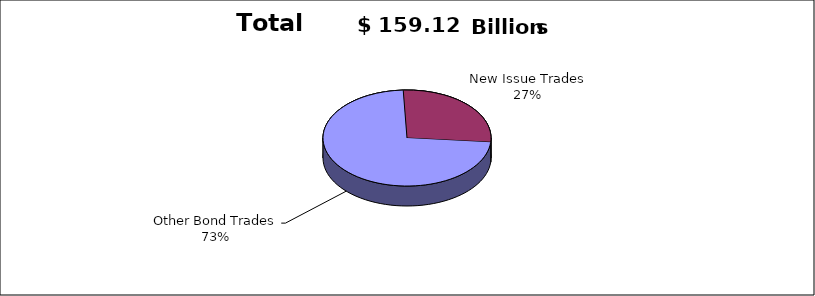
| Category | Series 0 |
|---|---|
| Other Bond Trades | 115984201684 |
| New Issue Trades | 43133218361 |